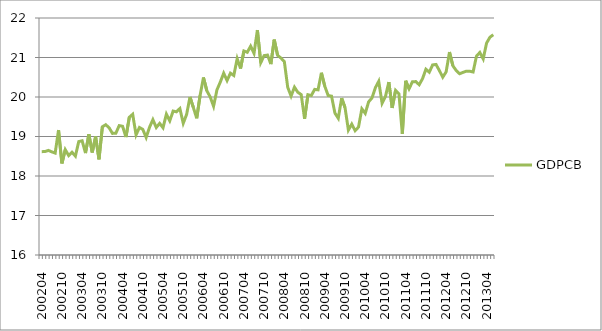
| Category | GDPCB |
|---|---|
| 200204.0 | 18.616 |
| 200205.0 | 18.62 |
| 200206.0 | 18.648 |
| 200207.0 | 18.611 |
| 200208.0 | 18.58 |
| 200209.0 | 19.164 |
| 200210.0 | 18.318 |
| 200211.0 | 18.667 |
| 200212.0 | 18.518 |
| 200301.0 | 18.601 |
| 200302.0 | 18.504 |
| 200303.0 | 18.872 |
| 200304.0 | 18.892 |
| 200305.0 | 18.58 |
| 200306.0 | 19.058 |
| 200307.0 | 18.595 |
| 200308.0 | 19 |
| 200309.0 | 18.422 |
| 200310.0 | 19.245 |
| 200311.0 | 19.298 |
| 200312.0 | 19.222 |
| 200401.0 | 19.079 |
| 200402.0 | 19.082 |
| 200403.0 | 19.276 |
| 200404.0 | 19.259 |
| 200405.0 | 18.986 |
| 200406.0 | 19.487 |
| 200407.0 | 19.563 |
| 200408.0 | 19.042 |
| 200409.0 | 19.228 |
| 200410.0 | 19.18 |
| 200411.0 | 18.974 |
| 200412.0 | 19.235 |
| 200501.0 | 19.426 |
| 200502.0 | 19.228 |
| 200503.0 | 19.332 |
| 200504.0 | 19.221 |
| 200505.0 | 19.565 |
| 200506.0 | 19.397 |
| 200507.0 | 19.644 |
| 200508.0 | 19.624 |
| 200509.0 | 19.708 |
| 200510.0 | 19.335 |
| 200511.0 | 19.559 |
| 200512.0 | 20 |
| 200601.0 | 19.734 |
| 200602.0 | 19.461 |
| 200603.0 | 20.04 |
| 200604.0 | 20.495 |
| 200605.0 | 20.158 |
| 200606.0 | 20.002 |
| 200607.0 | 19.766 |
| 200608.0 | 20.181 |
| 200609.0 | 20.379 |
| 200610.0 | 20.602 |
| 200611.0 | 20.417 |
| 200612.0 | 20.603 |
| 200701.0 | 20.546 |
| 200702.0 | 20.972 |
| 200703.0 | 20.721 |
| 200704.0 | 21.165 |
| 200705.0 | 21.132 |
| 200706.0 | 21.287 |
| 200707.0 | 21.106 |
| 200708.0 | 21.695 |
| 200709.0 | 20.87 |
| 200710.0 | 21.048 |
| 200711.0 | 21.061 |
| 200712.0 | 20.833 |
| 200801.0 | 21.452 |
| 200802.0 | 21.055 |
| 200803.0 | 20.986 |
| 200804.0 | 20.894 |
| 200805.0 | 20.245 |
| 200806.0 | 20.024 |
| 200807.0 | 20.248 |
| 200808.0 | 20.119 |
| 200809.0 | 20.061 |
| 200810.0 | 19.449 |
| 200811.0 | 20.057 |
| 200812.0 | 20.038 |
| 200901.0 | 20.193 |
| 200902.0 | 20.181 |
| 200903.0 | 20.614 |
| 200904.0 | 20.272 |
| 200905.0 | 20.037 |
| 200906.0 | 20.021 |
| 200907.0 | 19.593 |
| 200908.0 | 19.461 |
| 200909.0 | 19.971 |
| 200910.0 | 19.733 |
| 200911.0 | 19.163 |
| 200912.0 | 19.313 |
| 201001.0 | 19.147 |
| 201002.0 | 19.239 |
| 201003.0 | 19.701 |
| 201004.0 | 19.586 |
| 201005.0 | 19.877 |
| 201006.0 | 19.977 |
| 201007.0 | 20.234 |
| 201008.0 | 20.397 |
| 201009.0 | 19.842 |
| 201010.0 | 20.014 |
| 201011.0 | 20.378 |
| 201012.0 | 19.723 |
| 201101.0 | 20.169 |
| 201102.0 | 20.08 |
| 201103.0 | 19.07 |
| 201104.0 | 20.411 |
| 201105.0 | 20.207 |
| 201106.0 | 20.386 |
| 201107.0 | 20.39 |
| 201108.0 | 20.311 |
| 201109.0 | 20.463 |
| 201110.0 | 20.703 |
| 201111.0 | 20.629 |
| 201112.0 | 20.812 |
| 201201.0 | 20.824 |
| 201202.0 | 20.669 |
| 201203.0 | 20.502 |
| 201204.0 | 20.636 |
| 201205.0 | 21.138 |
| 201206.0 | 20.791 |
| 201207.0 | 20.669 |
| 201208.0 | 20.589 |
| 201209.0 | 20.623 |
| 201210.0 | 20.654 |
| 201211.0 | 20.653 |
| 201212.0 | 20.633 |
| 201301.0 | 21.034 |
| 201302.0 | 21.127 |
| 201303.0 | 20.964 |
| 201304.0 | 21.365 |
| 201305.0 | 21.514 |
| 201306.0 | 21.576 |